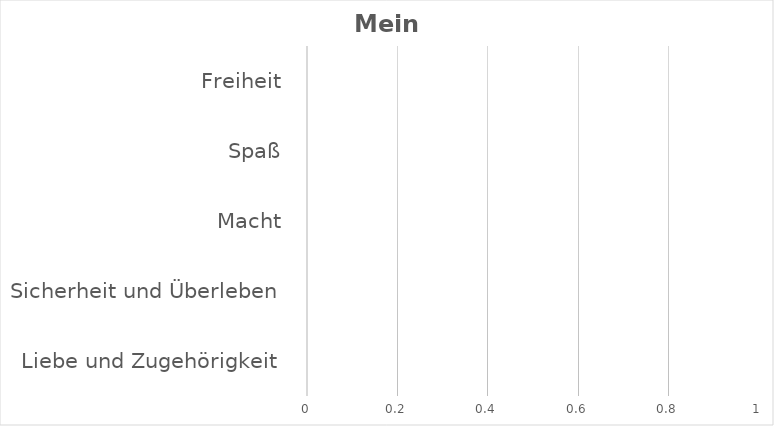
| Category | Series 0 |
|---|---|
| Liebe und Zugehörigkeit | 0 |
| Sicherheit und Überleben | 0 |
| Macht | 0 |
| Spaß | 0 |
| Freiheit | 0 |